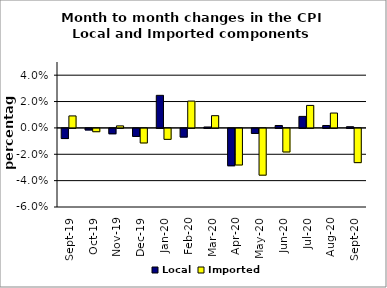
| Category | Local | Imported |
|---|---|---|
| 2019-09-01 | -0.008 | 0.009 |
| 2019-10-01 | -0.001 | -0.003 |
| 2019-11-01 | -0.004 | 0.002 |
| 2019-12-01 | -0.006 | -0.011 |
| 2020-01-01 | 0.025 | -0.008 |
| 2020-02-01 | -0.007 | 0.02 |
| 2020-03-01 | 0.001 | 0.009 |
| 2020-04-01 | -0.028 | -0.028 |
| 2020-05-01 | -0.004 | -0.035 |
| 2020-06-01 | 0.002 | -0.018 |
| 2020-07-01 | 0.009 | 0.017 |
| 2020-08-01 | 0.002 | 0.011 |
| 2020-09-01 | 0.001 | -0.026 |